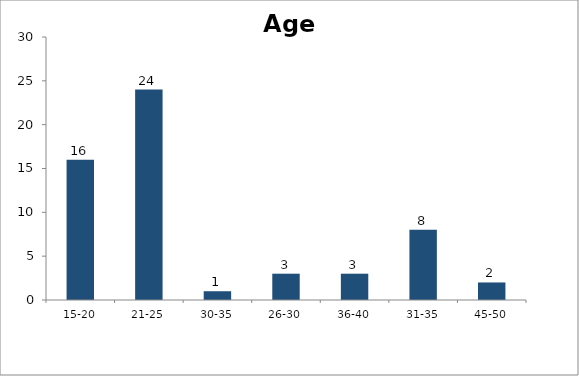
| Category | Age |
|---|---|
| 15-20 | 16 |
| 21-25 | 24 |
| 30-35 | 1 |
| 26-30 | 3 |
| 36-40 | 3 |
| 31-35 | 8 |
| 45-50 | 2 |